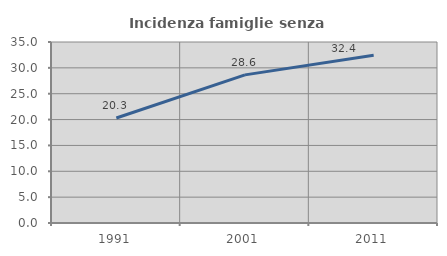
| Category | Incidenza famiglie senza nuclei |
|---|---|
| 1991.0 | 20.301 |
| 2001.0 | 28.641 |
| 2011.0 | 32.419 |